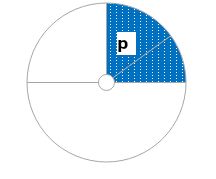
| Category | Series 0 |
|---|---|
| p | 0.15 |